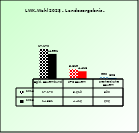
| Category | 2018 | 2023 |
|---|---|---|
| Bgld. Bauernbund | 17170 | 14331 |
| SPÖ Bauern | 5619 | 4416 |
| Freiheitliche Bauern | 890 | 606 |